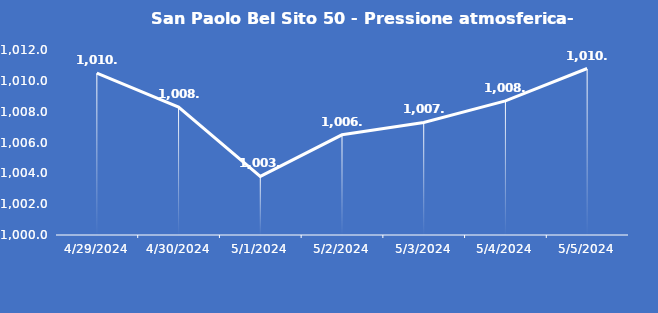
| Category | San Paolo Bel Sito 50 - Pressione atmosferica- Grezzo (hPa) |
|---|---|
| 4/29/24 | 1010.5 |
| 4/30/24 | 1008.3 |
| 5/1/24 | 1003.8 |
| 5/2/24 | 1006.5 |
| 5/3/24 | 1007.3 |
| 5/4/24 | 1008.7 |
| 5/5/24 | 1010.8 |